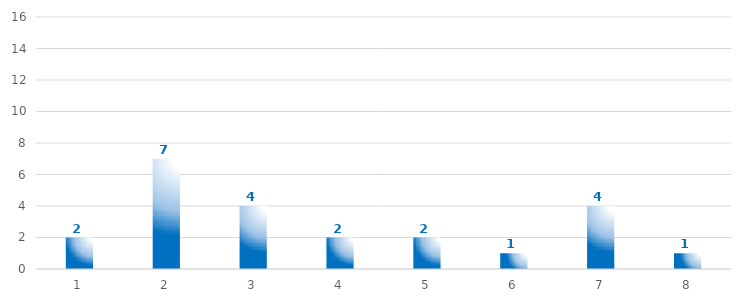
| Category | Series 0 |
|---|---|
| 0 | 2 |
| 1 | 7 |
| 2 | 4 |
| 3 | 2 |
| 4 | 2 |
| 5 | 1 |
| 6 | 4 |
| 7 | 1 |